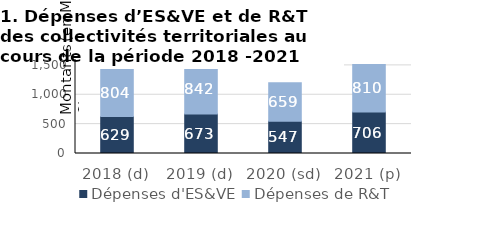
| Category | Dépenses d'ES&VE | Dépenses de R&T |
|---|---|---|
| 2018 (d) | 629 | 804 |
| 2019 (d) | 673 | 842 |
| 2020 (sd) | 547 | 659 |
| 2021 (p) | 706 | 810 |